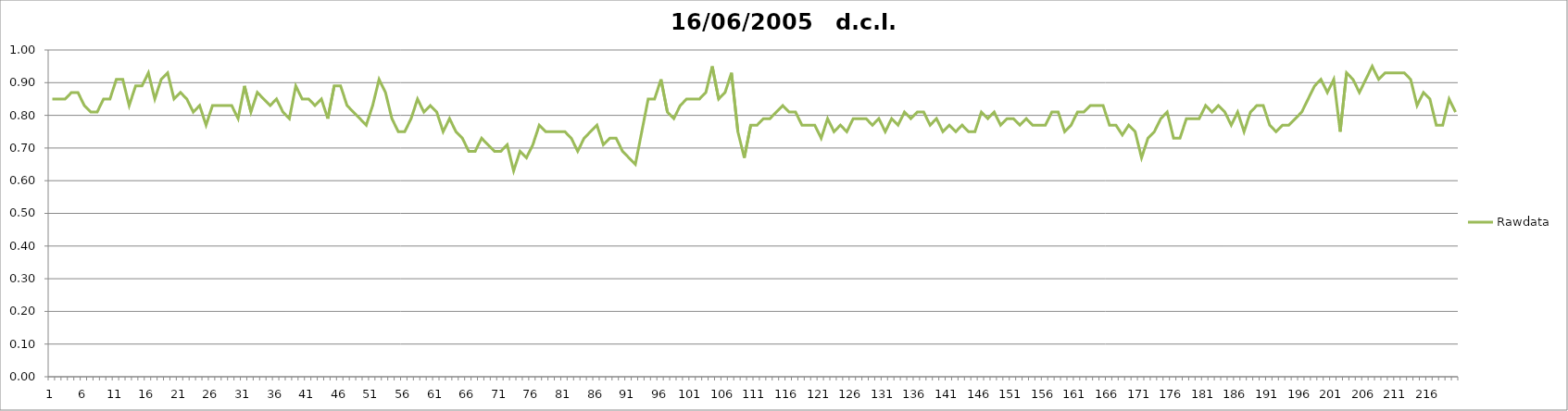
| Category | Rawdata |
|---|---|
| 0 | 0.85 |
| 1 | 0.85 |
| 2 | 0.85 |
| 3 | 0.87 |
| 4 | 0.87 |
| 5 | 0.83 |
| 6 | 0.81 |
| 7 | 0.81 |
| 8 | 0.85 |
| 9 | 0.85 |
| 10 | 0.91 |
| 11 | 0.91 |
| 12 | 0.83 |
| 13 | 0.89 |
| 14 | 0.89 |
| 15 | 0.93 |
| 16 | 0.85 |
| 17 | 0.91 |
| 18 | 0.93 |
| 19 | 0.85 |
| 20 | 0.87 |
| 21 | 0.85 |
| 22 | 0.81 |
| 23 | 0.83 |
| 24 | 0.77 |
| 25 | 0.83 |
| 26 | 0.83 |
| 27 | 0.83 |
| 28 | 0.83 |
| 29 | 0.79 |
| 30 | 0.89 |
| 31 | 0.81 |
| 32 | 0.87 |
| 33 | 0.85 |
| 34 | 0.83 |
| 35 | 0.85 |
| 36 | 0.81 |
| 37 | 0.79 |
| 38 | 0.89 |
| 39 | 0.85 |
| 40 | 0.85 |
| 41 | 0.83 |
| 42 | 0.85 |
| 43 | 0.79 |
| 44 | 0.89 |
| 45 | 0.89 |
| 46 | 0.83 |
| 47 | 0.81 |
| 48 | 0.79 |
| 49 | 0.77 |
| 50 | 0.83 |
| 51 | 0.91 |
| 52 | 0.87 |
| 53 | 0.79 |
| 54 | 0.75 |
| 55 | 0.75 |
| 56 | 0.79 |
| 57 | 0.85 |
| 58 | 0.81 |
| 59 | 0.83 |
| 60 | 0.81 |
| 61 | 0.75 |
| 62 | 0.79 |
| 63 | 0.75 |
| 64 | 0.73 |
| 65 | 0.69 |
| 66 | 0.69 |
| 67 | 0.73 |
| 68 | 0.71 |
| 69 | 0.69 |
| 70 | 0.69 |
| 71 | 0.71 |
| 72 | 0.63 |
| 73 | 0.69 |
| 74 | 0.67 |
| 75 | 0.71 |
| 76 | 0.77 |
| 77 | 0.75 |
| 78 | 0.75 |
| 79 | 0.75 |
| 80 | 0.75 |
| 81 | 0.73 |
| 82 | 0.69 |
| 83 | 0.73 |
| 84 | 0.75 |
| 85 | 0.77 |
| 86 | 0.71 |
| 87 | 0.73 |
| 88 | 0.73 |
| 89 | 0.69 |
| 90 | 0.67 |
| 91 | 0.65 |
| 92 | 0.75 |
| 93 | 0.85 |
| 94 | 0.85 |
| 95 | 0.91 |
| 96 | 0.81 |
| 97 | 0.79 |
| 98 | 0.83 |
| 99 | 0.85 |
| 100 | 0.85 |
| 101 | 0.85 |
| 102 | 0.87 |
| 103 | 0.95 |
| 104 | 0.85 |
| 105 | 0.87 |
| 106 | 0.93 |
| 107 | 0.75 |
| 108 | 0.67 |
| 109 | 0.77 |
| 110 | 0.77 |
| 111 | 0.79 |
| 112 | 0.79 |
| 113 | 0.81 |
| 114 | 0.83 |
| 115 | 0.81 |
| 116 | 0.81 |
| 117 | 0.77 |
| 118 | 0.77 |
| 119 | 0.77 |
| 120 | 0.73 |
| 121 | 0.79 |
| 122 | 0.75 |
| 123 | 0.77 |
| 124 | 0.75 |
| 125 | 0.79 |
| 126 | 0.79 |
| 127 | 0.79 |
| 128 | 0.77 |
| 129 | 0.79 |
| 130 | 0.75 |
| 131 | 0.79 |
| 132 | 0.77 |
| 133 | 0.81 |
| 134 | 0.79 |
| 135 | 0.81 |
| 136 | 0.81 |
| 137 | 0.77 |
| 138 | 0.79 |
| 139 | 0.75 |
| 140 | 0.77 |
| 141 | 0.75 |
| 142 | 0.77 |
| 143 | 0.75 |
| 144 | 0.75 |
| 145 | 0.81 |
| 146 | 0.79 |
| 147 | 0.81 |
| 148 | 0.77 |
| 149 | 0.79 |
| 150 | 0.79 |
| 151 | 0.77 |
| 152 | 0.79 |
| 153 | 0.77 |
| 154 | 0.77 |
| 155 | 0.77 |
| 156 | 0.81 |
| 157 | 0.81 |
| 158 | 0.75 |
| 159 | 0.77 |
| 160 | 0.81 |
| 161 | 0.81 |
| 162 | 0.83 |
| 163 | 0.83 |
| 164 | 0.83 |
| 165 | 0.77 |
| 166 | 0.77 |
| 167 | 0.74 |
| 168 | 0.77 |
| 169 | 0.75 |
| 170 | 0.67 |
| 171 | 0.73 |
| 172 | 0.75 |
| 173 | 0.79 |
| 174 | 0.81 |
| 175 | 0.73 |
| 176 | 0.73 |
| 177 | 0.79 |
| 178 | 0.79 |
| 179 | 0.79 |
| 180 | 0.83 |
| 181 | 0.81 |
| 182 | 0.83 |
| 183 | 0.81 |
| 184 | 0.77 |
| 185 | 0.81 |
| 186 | 0.75 |
| 187 | 0.81 |
| 188 | 0.83 |
| 189 | 0.83 |
| 190 | 0.77 |
| 191 | 0.75 |
| 192 | 0.77 |
| 193 | 0.77 |
| 194 | 0.79 |
| 195 | 0.81 |
| 196 | 0.85 |
| 197 | 0.89 |
| 198 | 0.91 |
| 199 | 0.87 |
| 200 | 0.91 |
| 201 | 0.75 |
| 202 | 0.93 |
| 203 | 0.91 |
| 204 | 0.87 |
| 205 | 0.91 |
| 206 | 0.95 |
| 207 | 0.91 |
| 208 | 0.93 |
| 209 | 0.93 |
| 210 | 0.93 |
| 211 | 0.93 |
| 212 | 0.91 |
| 213 | 0.83 |
| 214 | 0.87 |
| 215 | 0.85 |
| 216 | 0.77 |
| 217 | 0.77 |
| 218 | 0.85 |
| 219 | 0.81 |